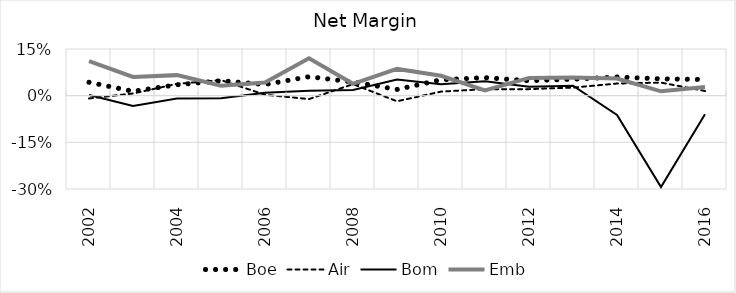
| Category | Boe | Air | Bom | Emb |
|---|---|---|---|---|
| 2002.0 | 0.043 | -0.009 | 0.002 | 0.111 |
| 2003.0 | 0.014 | 0.007 | -0.033 | 0.06 |
| 2004.0 | 0.035 | 0.038 | -0.009 | 0.066 |
| 2005.0 | 0.048 | 0.05 | -0.008 | 0.032 |
| 2006.0 | 0.036 | 0.003 | 0.009 | 0.042 |
| 2007.0 | 0.061 | -0.011 | 0.016 | 0.12 |
| 2008.0 | 0.044 | 0.037 | 0.018 | 0.038 |
| 2009.0 | 0.02 | -0.018 | 0.052 | 0.086 |
| 2010.0 | 0.051 | 0.013 | 0.037 | 0.064 |
| 2011.0 | 0.058 | 0.021 | 0.046 | 0.017 |
| 2012.0 | 0.048 | 0.021 | 0.029 | 0.057 |
| 2013.0 | 0.053 | 0.026 | 0.032 | 0.058 |
| 2014.0 | 0.06 | 0.039 | -0.062 | 0.055 |
| 2015.0 | 0.054 | 0.042 | -0.294 | 0.014 |
| 2016.0 | 0.052 | 0.015 | -0.06 | 0.028 |